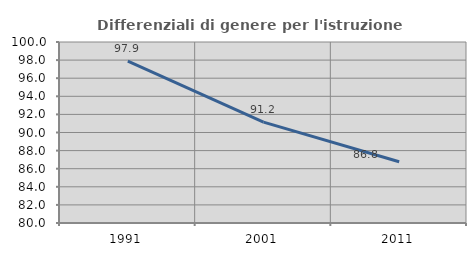
| Category | Differenziali di genere per l'istruzione superiore |
|---|---|
| 1991.0 | 97.876 |
| 2001.0 | 91.151 |
| 2011.0 | 86.774 |